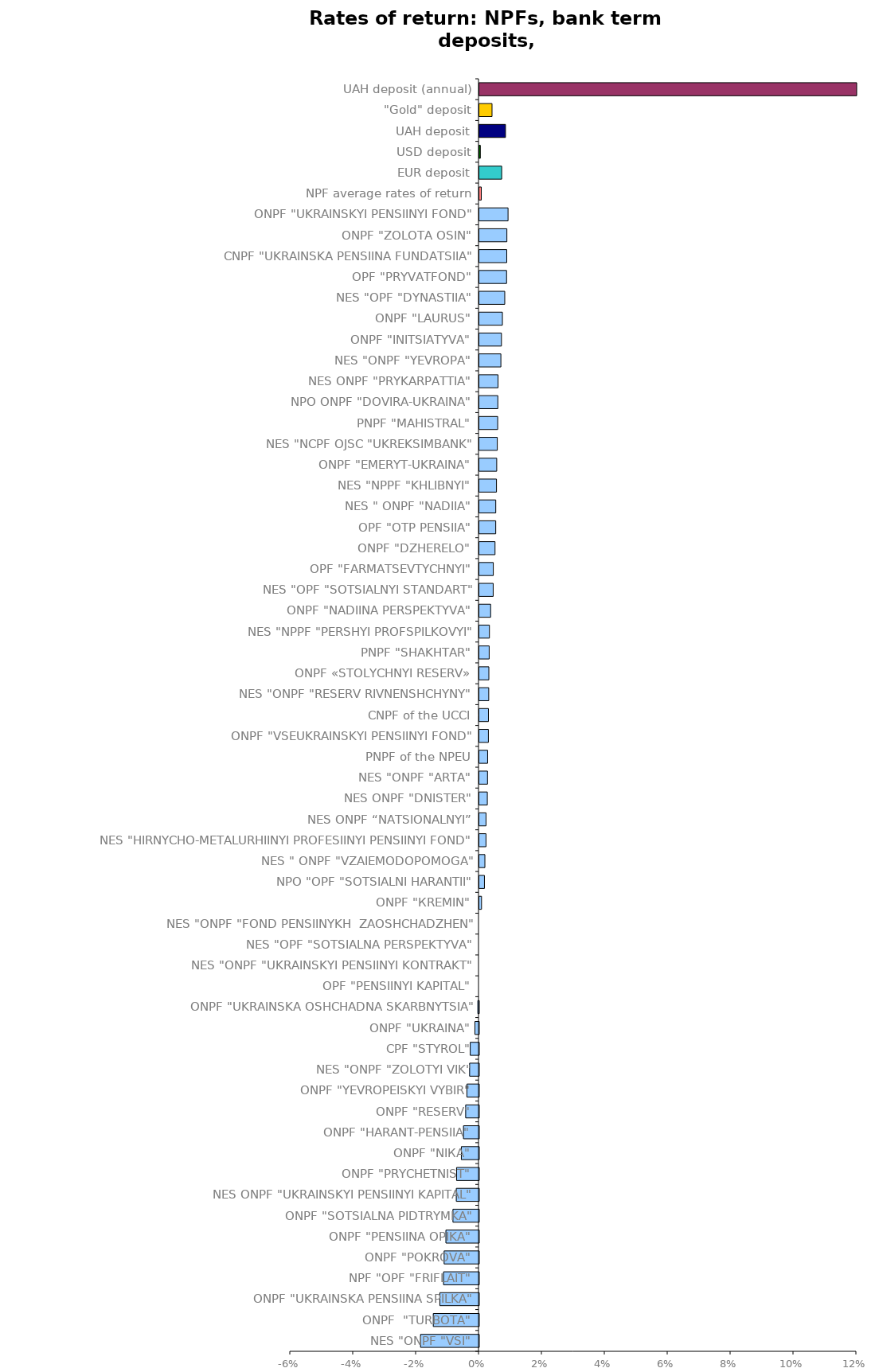
| Category | Series 0 |
|---|---|
| NES "ONPF "VSI" | -0.019 |
| ONPF  "TURBOTA" | -0.015 |
| ONPF "UKRAINSKA PENSIINA SPILKA" | -0.012 |
| NPF "OPF "FRIFLAIT" | -0.011 |
| ONPF "POKROVA" | -0.011 |
| ONPF "PENSIINA OPIKA" | -0.01 |
| ONPF "SOTSIALNA PIDTRYMKA" | -0.008 |
| NES ONPF "UKRAINSKYI PENSIINYI KAPITAL" | -0.007 |
| ONPF "PRYCHETNIST" | -0.007 |
| ONPF "NIКА" | -0.006 |
| ONPF "HARANT-PENSIIA" | -0.005 |
| ONPF "RESERV" | -0.004 |
| ONPF "YEVROPEISKYI VYBIR" | -0.004 |
| NES "ONPF "ZOLOTYI VIK" | -0.003 |
| CPF "STYROL" | -0.003 |
| ONPF "UKRAINA" | -0.001 |
| ONPF "UKRAINSKA OSHCHADNA SKARBNYTSIA" | 0 |
| OPF "PENSIINYI KAPITAL" | 0 |
| NES "ONPF "UKRAINSKYI PENSIINYI KONTRAKT" | 0 |
| NES "OPF "SOTSIALNA PERSPEKTYVA" | 0 |
| NES "ONPF "FOND PENSIINYKH  ZAOSHCHADZHEN" | 0 |
| ONPF "КREMIN" | 0.001 |
| NPO "OPF "SOTSIALNI HARANTII" | 0.002 |
| NES " ONPF "VZAIEMODOPOMOGA" | 0.002 |
| NES "HIRNYCHO-METALURHIINYI PROFESIINYI PENSIINYI FOND" | 0.002 |
| NES ONPF “NATSIONALNYI” | 0.002 |
| NES ONPF "DNISTER" | 0.003 |
| NES "ONPF "АRТА" | 0.003 |
| PNPF of the NPEU | 0.003 |
| ONPF "VSEUKRAINSKYI PENSIINYI FOND" | 0.003 |
| CNPF of the UCCI | 0.003 |
| NES "ONPF "RESERV RIVNENSHCHYNY" | 0.003 |
| ONPF «STOLYCHNYI RESERV» | 0.003 |
| PNPF "SHAKHTAR" | 0.003 |
| NES "NPPF "PERSHYI PROFSPILKOVYI" | 0.003 |
| ONPF "NADIINA PERSPEKTYVA" | 0.004 |
| NES "OPF "SOTSIALNYI STANDART" | 0.004 |
| OPF "FARMATSEVTYCHNYI" | 0.004 |
| ONPF "DZHERELO" | 0.005 |
| OPF "ОТP PENSIIA" | 0.005 |
| NES " ONPF "NADIIA" | 0.005 |
| NES "NPPF "KHLIBNYI" | 0.005 |
| ONPF "ЕMERYT-UKRAINA" | 0.006 |
| NES "NCPF OJSC "UKREKSIMBANK" | 0.006 |
| PNPF "МAHISTRAL" | 0.006 |
| NPO ONPF "DOVIRA-UKRAINA" | 0.006 |
| NES ONPF "PRYKARPATTIA" | 0.006 |
| NES "ONPF "YEVROPA" | 0.007 |
| ONPF "INITSIATYVA" | 0.007 |
| ONPF "LAURUS" | 0.007 |
| NES "OPF "DYNASTIIA" | 0.008 |
| OPF "PRYVATFOND" | 0.009 |
| CNPF "UKRAINSKA PENSIINA FUNDATSIIA" | 0.009 |
| ONPF "ZOLOTA OSIN" | 0.009 |
| ONPF "UKRAINSKYI PENSIINYI FOND" | 0.009 |
| NPF average rates of return | 0.001 |
| EUR deposit | 0.007 |
| USD deposit | 0 |
| UAH deposit | 0.008 |
| "Gold" deposit | 0.004 |
| UAH deposit (annual) | 0.12 |